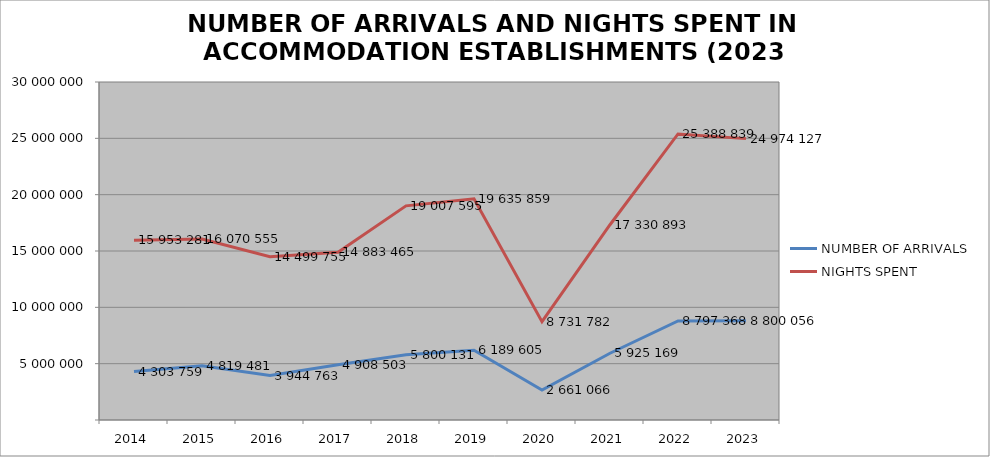
| Category | NUMBER OF ARRIVALS | NIGHTS SPENT |
|---|---|---|
| 2014 | 4303759 | 15953281 |
| 2015 | 4819481 | 16070555 |
| 2016 | 3944763 | 14499755 |
| 2017 | 4908503 | 14883465 |
| 2018 | 5800131 | 19007595 |
| 2019 | 6189605 | 19635859 |
| 2020 | 2661066 | 8731782 |
| 2021 | 5925169 | 17330893 |
| 2022 | 8797368 | 25388839 |
| 2023 | 8800056 | 24974127 |